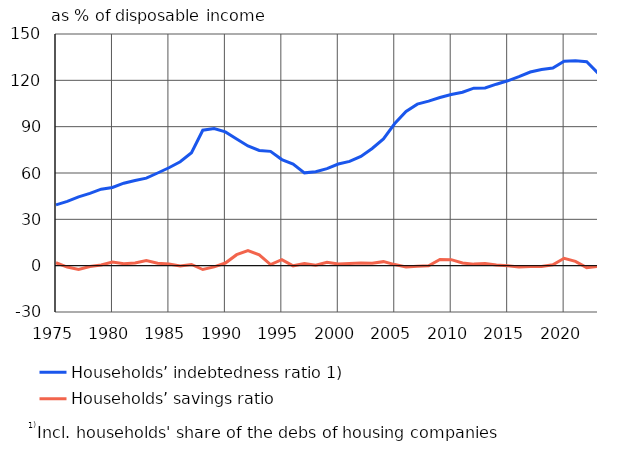
| Category | Households’ indebtedness ratio 1)  | Households’ savings ratio |
|---|---|---|
| 1975 | 39.4 | 1.9 |
| 1976 | 41.6 | -0.9 |
| 1977 | 44.5 | -2.5 |
| 1978 | 46.8 | -0.6 |
| 1979 | 49.5 | 0.4 |
| 1980 | 50.6 | 2.4 |
| 1981 | 53.4 | 1.3 |
| 1982 | 55.1 | 1.7 |
| 1983 | 56.7 | 3.3 |
| 1984 | 60 | 1.6 |
| 1985 | 63.4 | 1.1 |
| 1986 | 67.3 | -0.2 |
| 1987 | 73.1 | 0.8 |
| 1988 | 87.7 | -2.5 |
| 1989 | 88.8 | -0.8 |
| 1990 | 86.6 | 1.7 |
| 1991 | 82 | 7.1 |
| 1992 | 77.5 | 9.8 |
| 1993 | 74.6 | 7 |
| 1994 | 74 | 0.7 |
| 1995 | 68.7 | 3.9 |
| 1996 | 65.8 | -0.1 |
| 1997 | 60.1 | 1.4 |
| 1998 | 60.8 | 0.3 |
| 1999 | 62.8 | 2.2 |
| 2000 | 65.8 | 1.1 |
| 2001 | 67.5 | 1.4 |
| 2002 | 70.7 | 1.8 |
| 2003 | 75.9 | 1.6 |
| 2004 | 82.1 | 2.6 |
| 2005 | 92 | 0.7 |
| 2006 | 99.9 | -0.8 |
| 2007 | 104.6 | -0.3 |
| 2008 | 106.5 | -0.1 |
| 2009 | 108.9 | 4 |
| 2010 | 110.8 | 3.9 |
| 2011 | 112.3 | 1.7 |
| 2012 | 114.9 | 1 |
| 2013 | 115.1 | 1.4 |
| 2014 | 117.5 | 0.5 |
| 2015 | 119.7 | 0 |
| 2016 | 122.4 | -0.8 |
| 2017 | 125.4 | -0.6 |
| 2018 | 127 | -0.5 |
| 2019 | 128 | 0.6 |
| 2020 | 132.4 | 4.8 |
| 2021 | 132.7 | 2.8 |
| 2022* | 132 | -1.3 |
| 2023* | 124.6 | -0.4 |